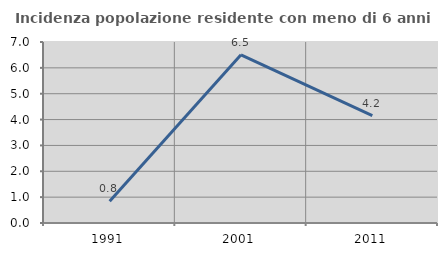
| Category | Incidenza popolazione residente con meno di 6 anni |
|---|---|
| 1991.0 | 0.837 |
| 2001.0 | 6.504 |
| 2011.0 | 4.151 |